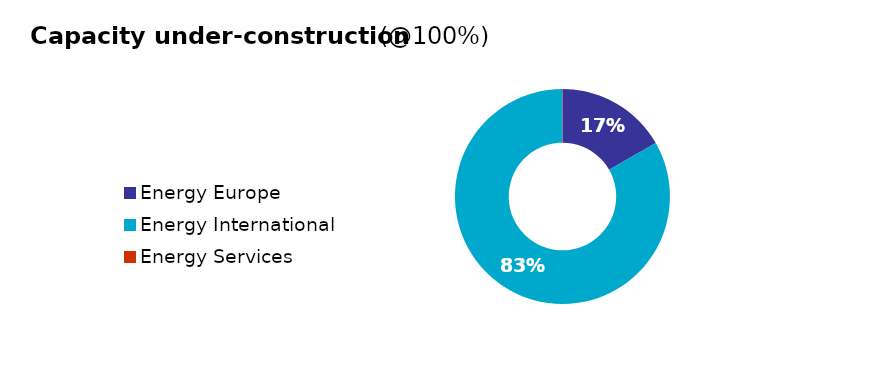
| Category | Total |
|---|---|
| Energy Europe | 1967.5 |
| Energy International | 9798.27 |
| Energy Services | 6.4 |